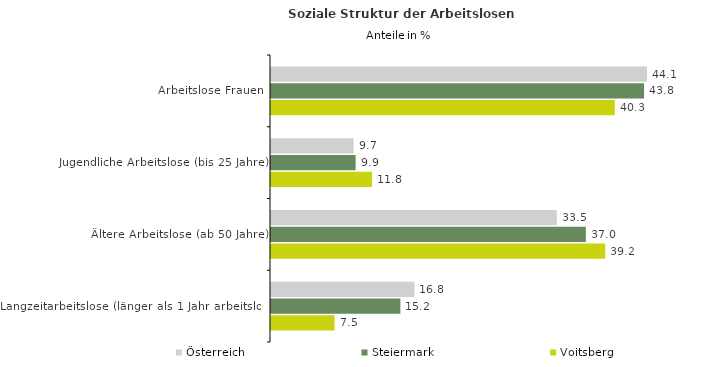
| Category | Österreich | Steiermark | Voitsberg |
|---|---|---|---|
| Arbeitslose Frauen | 44.136 | 43.785 | 40.347 |
| Jugendliche Arbeitslose (bis 25 Jahre) | 9.698 | 9.935 | 11.849 |
| Ältere Arbeitslose (ab 50 Jahre) | 33.548 | 36.954 | 39.224 |
| Langzeitarbeitslose (länger als 1 Jahr arbeitslos) | 16.836 | 15.186 | 7.457 |